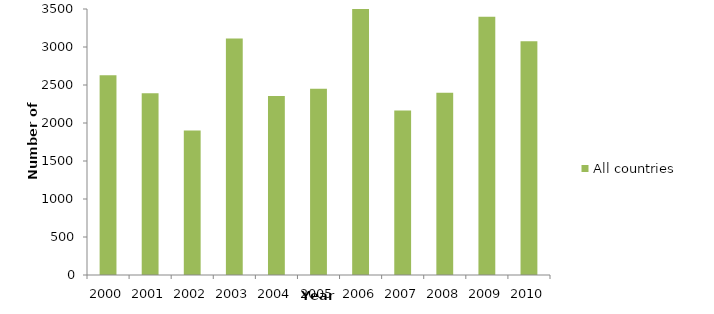
| Category | All countries |
|---|---|
| 2000.0 | 2629 |
| 2001.0 | 2393 |
| 2002.0 | 1900 |
| 2003.0 | 3113 |
| 2004.0 | 2354 |
| 2005.0 | 2452 |
| 2006.0 | 3506 |
| 2007.0 | 2163 |
| 2008.0 | 2397 |
| 2009.0 | 3397 |
| 2010.0 | 3077 |